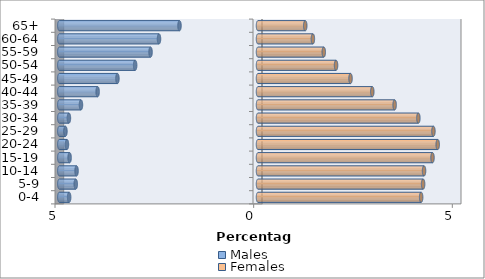
| Category | Males | Females |
|---|---|---|
| 0-4 | -4.753 | 4.106 |
| 5-9 | -4.587 | 4.156 |
| 10-14 | -4.567 | 4.179 |
| 15-19 | -4.742 | 4.392 |
| 20-24 | -4.809 | 4.523 |
| 25-29 | -4.847 | 4.415 |
| 30-34 | -4.759 | 4.036 |
| 35-39 | -4.456 | 3.439 |
| 40-44 | -4.036 | 2.876 |
| 45-49 | -3.538 | 2.329 |
| 50-54 | -3.092 | 1.964 |
| 55-59 | -2.705 | 1.655 |
| 60-64 | -2.492 | 1.381 |
| 65+ | -1.976 | 1.189 |